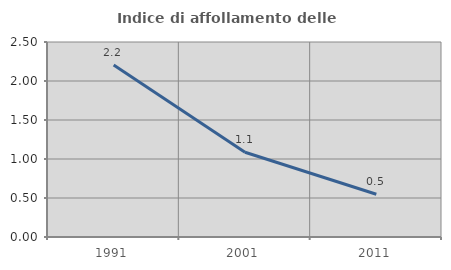
| Category | Indice di affollamento delle abitazioni  |
|---|---|
| 1991.0 | 2.206 |
| 2001.0 | 1.087 |
| 2011.0 | 0.549 |